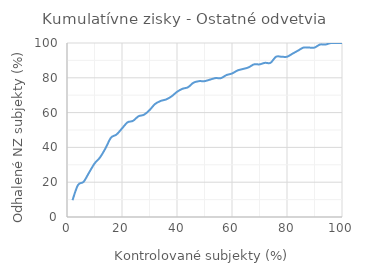
| Category | Ostatné odvetvia |
|---|---|
| 2.0 | 9.649 |
| 4.0 | 18.421 |
| 6.0 | 20.175 |
| 8.0 | 25.439 |
| 10.0 | 30.702 |
| 12.0 | 34.211 |
| 14.0 | 39.474 |
| 16.0 | 45.614 |
| 18.0 | 47.368 |
| 20.0 | 50.877 |
| 22.0 | 54.386 |
| 24.0 | 55.263 |
| 26.0 | 57.895 |
| 28.0 | 58.772 |
| 30.0 | 61.404 |
| 32.0 | 64.912 |
| 34.0 | 66.667 |
| 36.0 | 67.544 |
| 38.0 | 69.298 |
| 40.0 | 71.93 |
| 42.0 | 73.684 |
| 44.0 | 74.561 |
| 46.0 | 77.193 |
| 48.0 | 78.07 |
| 50.0 | 78.07 |
| 52.0 | 78.947 |
| 54.0 | 79.825 |
| 56.0 | 79.825 |
| 58.0 | 81.579 |
| 60.0 | 82.456 |
| 62.0 | 84.211 |
| 64.0 | 85.088 |
| 66.0 | 85.965 |
| 68.0 | 87.719 |
| 70.0 | 87.719 |
| 72.0 | 88.596 |
| 74.0 | 88.596 |
| 76.0 | 92.105 |
| 78.0 | 92.105 |
| 80.0 | 92.105 |
| 82.0 | 93.86 |
| 84.0 | 95.614 |
| 86.0 | 97.368 |
| 88.0 | 97.368 |
| 90.0 | 97.368 |
| 92.0 | 99.123 |
| 94.0 | 99.123 |
| 96.0 | 100 |
| 98.0 | 100 |
| 100.0 | 100 |